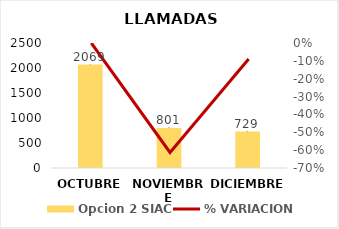
| Category | Opcion 2 SIAC |
|---|---|
| OCTUBRE | 2069 |
| NOVIEMBRE | 801 |
| DICIEMBRE | 729 |